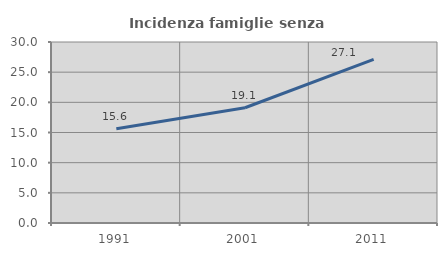
| Category | Incidenza famiglie senza nuclei |
|---|---|
| 1991.0 | 15.637 |
| 2001.0 | 19.1 |
| 2011.0 | 27.135 |